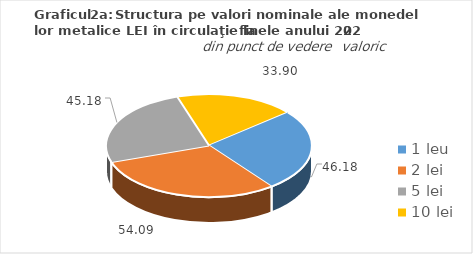
| Category | Series 0 |
|---|---|
| 1 leu | 46.18 |
| 2 lei | 54.09 |
| 5 lei | 45.18 |
| 10 lei | 33.9 |